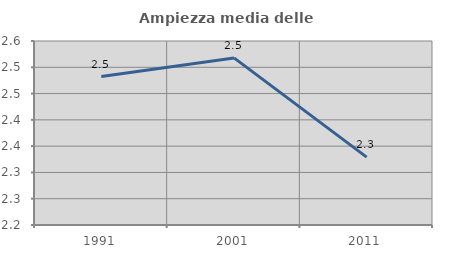
| Category | Ampiezza media delle famiglie |
|---|---|
| 1991.0 | 2.482 |
| 2001.0 | 2.518 |
| 2011.0 | 2.329 |